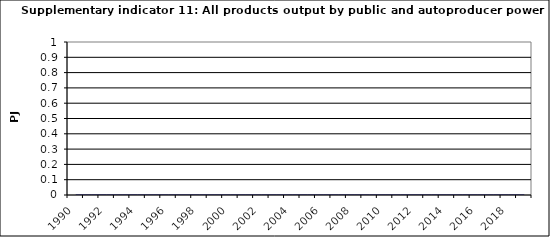
| Category | All products output by public and autoproducer power stations, PJ |
|---|---|
| 1990 | 0 |
| 1991 | 0 |
| 1992 | 0 |
| 1993 | 0 |
| 1994 | 0 |
| 1995 | 0 |
| 1996 | 0 |
| 1997 | 0 |
| 1998 | 0 |
| 1999 | 0 |
| 2000 | 0 |
| 2001 | 0 |
| 2002 | 0 |
| 2003 | 0 |
| 2004 | 0 |
| 2005 | 0 |
| 2006 | 0 |
| 2007 | 0 |
| 2008 | 0 |
| 2009 | 0 |
| 2010 | 0 |
| 2011 | 0 |
| 2012 | 0 |
| 2013 | 0 |
| 2014 | 0 |
| 2015 | 0 |
| 2016 | 0 |
| 2017 | 0 |
| 2018 | 0 |
| 2019 | 0 |